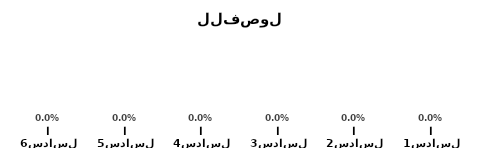
| Category | Series 0 | Series 1 |
|---|---|---|
| السادس1 |  | 0 |
| السادس2 |  | 0 |
| السادس3 |  | 0 |
| السادس4 |  | 0 |
| السادس5 |  | 0 |
| السادس6 |  | 0 |